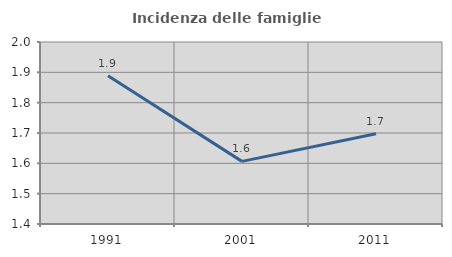
| Category | Incidenza delle famiglie numerose |
|---|---|
| 1991.0 | 1.889 |
| 2001.0 | 1.606 |
| 2011.0 | 1.698 |